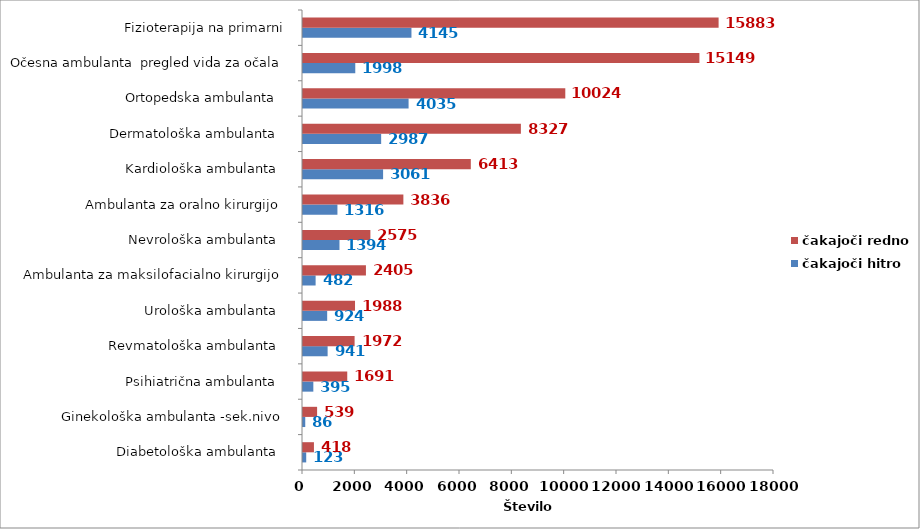
| Category | čakajoči hitro | čakajoči redno |
|---|---|---|
| Diabetološka ambulanta   | 123 | 418 |
| Ginekološka ambulanta -sek.nivo  | 86 | 539 |
| Psihiatrična ambulanta   | 395 | 1691 |
| Revmatološka ambulanta   | 941 | 1972 |
| Urološka ambulanta   | 924 | 1988 |
| Ambulanta za maksilofacialno kirurgijo  | 482 | 2405 |
| Nevrološka ambulanta   | 1394 | 2575 |
| Ambulanta za oralno kirurgijo  | 1316 | 3836 |
| Kardiološka ambulanta   | 3061 | 6413 |
| Dermatološka ambulanta   | 2987 | 8327 |
| Ortopedska ambulanta   | 4035 | 10024 |
| Očesna ambulanta  pregled vida za očala | 1998 | 15149 |
| Fizioterapija na primarni | 4145 | 15883 |